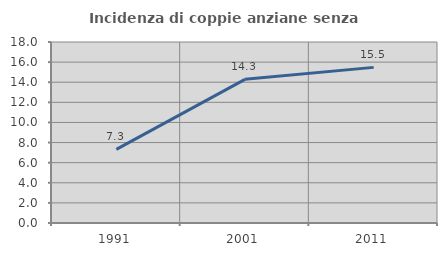
| Category | Incidenza di coppie anziane senza figli  |
|---|---|
| 1991.0 | 7.317 |
| 2001.0 | 14.286 |
| 2011.0 | 15.476 |